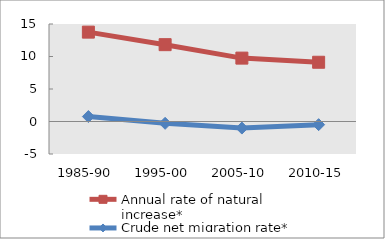
| Category | Annual rate of natural increase* | Crude net migration rate* |
|---|---|---|
| 1985-90 | 13.75 | 0.762 |
| 1995-00 | 11.82 | -0.279 |
| 2005-10 | 9.751 | -1.012 |
| 2010-15 | 9.115 | -0.485 |